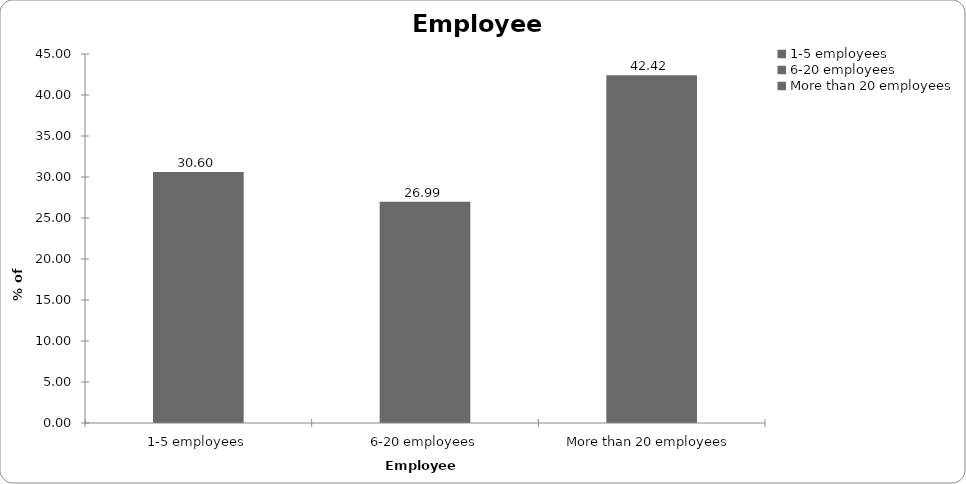
| Category | Employees |
|---|---|
| 1-5 employees | 30.598 |
| 6-20 employees | 26.986 |
| More than 20 employees | 42.416 |